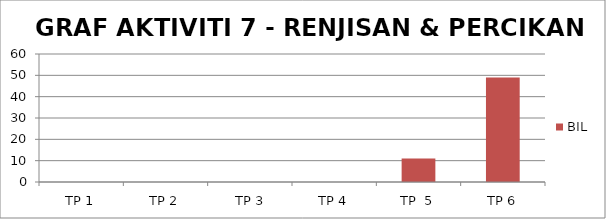
| Category | BIL |
|---|---|
| TP 1 | 0 |
| TP 2 | 0 |
|  TP 3 | 0 |
| TP 4 | 0 |
| TP  5 | 11 |
| TP 6 | 49 |